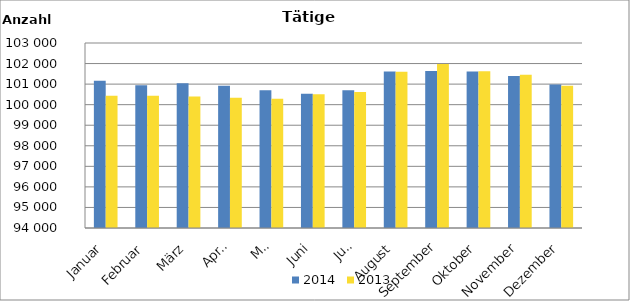
| Category | 2014 | 2013 |
|---|---|---|
| Januar | 101161 | 100430 |
| Februar | 100944 | 100438 |
| März | 101043 | 100396 |
| April | 100921 | 100334 |
| Mai | 100702 | 100284 |
| Juni | 100528 | 100506 |
| Juli | 100700 | 100618 |
| August | 101610 | 101604 |
| September | 101632 | 101973 |
| Oktober | 101610 | 101624 |
| November | 101398 | 101460 |
| Dezember | 100982 | 100923 |